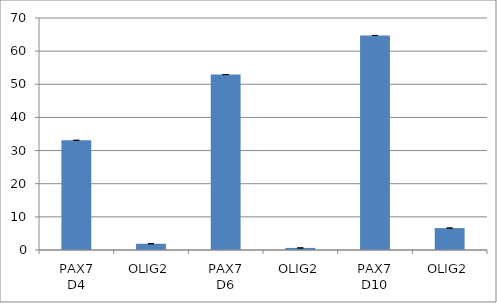
| Category | Series 0 |
|---|---|
| 0 | 33.093 |
| 1 | 1.881 |
| 2 | 52.933 |
| 3 | 0.632 |
| 4 | 64.732 |
| 5 | 6.617 |